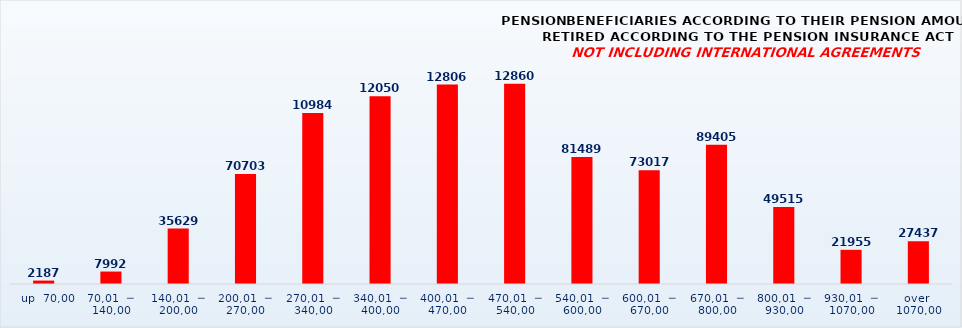
| Category | PENSION BENEFICIARIES ACCORDING TO TYPES AND AMOUNTS OF PENSION, RETIRED ACCORDING TO THE PENSION INSURANCE ACT
NOT INCLUDING INTERNATIONAL AGREEMENTS |
|---|---|
|   up  70,00 | 2187 |
| 70,01  ─  140,00 | 7992 |
| 140,01  ─  200,00 | 35629 |
| 200,01  ─  270,00 | 70703 |
| 270,01  ─  340,00 | 109846 |
| 340,01  ─  400,00 | 120503 |
| 400,01  ─  470,00 | 128069 |
| 470,01  ─  540,00 | 128600 |
| 540,01  ─  600,00 | 81489 |
| 600,01  ─  670,00 | 73017 |
| 670,01  ─  800,00 | 89405 |
| 800,01  ─  930,00 | 49515 |
| 930,01  ─  1070,00 | 21955 |
| over  1070,00 | 27437 |